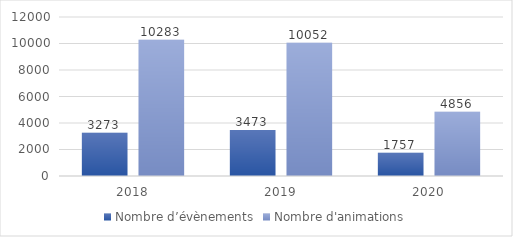
| Category | Nombre d’évènements | Nombre d'animations |
|---|---|---|
| 2018.0 | 3273 | 10283 |
| 2019.0 | 3473 | 10052 |
| 2020.0 | 1757 | 4856 |